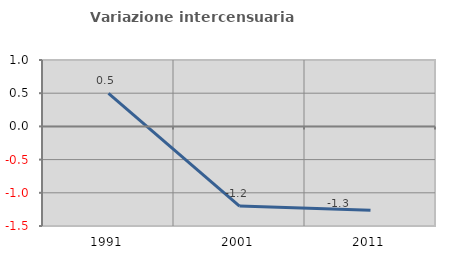
| Category | Variazione intercensuaria annua |
|---|---|
| 1991.0 | 0.496 |
| 2001.0 | -1.2 |
| 2011.0 | -1.264 |